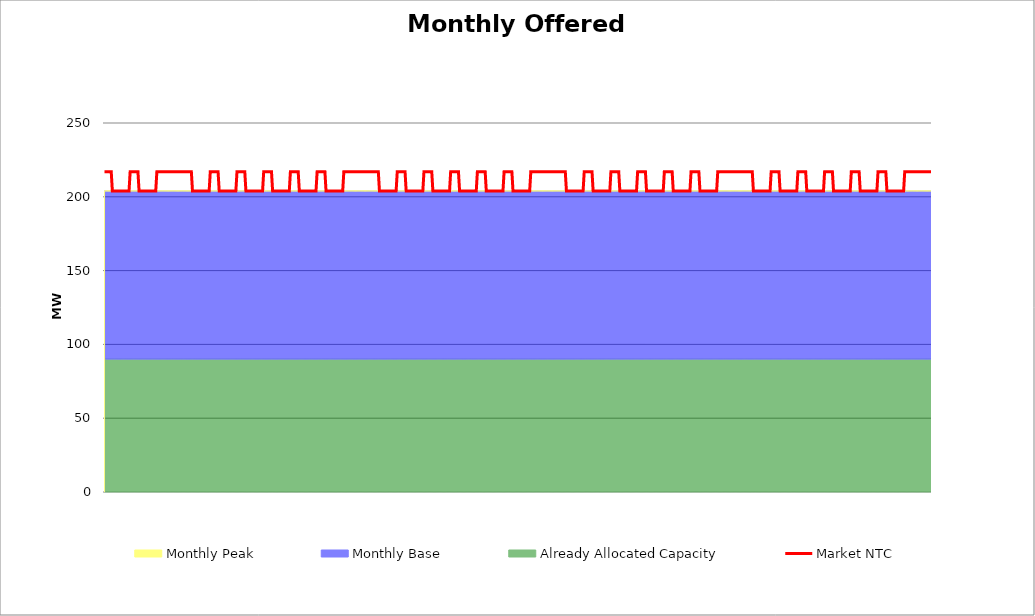
| Category | Market NTC |
|---|---|
| 0 | 217 |
| 1 | 217 |
| 2 | 217 |
| 3 | 217 |
| 4 | 217 |
| 5 | 217 |
| 6 | 217 |
| 7 | 204 |
| 8 | 204 |
| 9 | 204 |
| 10 | 204 |
| 11 | 204 |
| 12 | 204 |
| 13 | 204 |
| 14 | 204 |
| 15 | 204 |
| 16 | 204 |
| 17 | 204 |
| 18 | 204 |
| 19 | 204 |
| 20 | 204 |
| 21 | 204 |
| 22 | 204 |
| 23 | 217 |
| 24 | 217 |
| 25 | 217 |
| 26 | 217 |
| 27 | 217 |
| 28 | 217 |
| 29 | 217 |
| 30 | 217 |
| 31 | 204 |
| 32 | 204 |
| 33 | 204 |
| 34 | 204 |
| 35 | 204 |
| 36 | 204 |
| 37 | 204 |
| 38 | 204 |
| 39 | 204 |
| 40 | 204 |
| 41 | 204 |
| 42 | 204 |
| 43 | 204 |
| 44 | 204 |
| 45 | 204 |
| 46 | 204 |
| 47 | 217 |
| 48 | 217 |
| 49 | 217 |
| 50 | 217 |
| 51 | 217 |
| 52 | 217 |
| 53 | 217 |
| 54 | 217 |
| 55 | 217 |
| 56 | 217 |
| 57 | 217 |
| 58 | 217 |
| 59 | 217 |
| 60 | 217 |
| 61 | 217 |
| 62 | 217 |
| 63 | 217 |
| 64 | 217 |
| 65 | 217 |
| 66 | 217 |
| 67 | 217 |
| 68 | 217 |
| 69 | 217 |
| 70 | 217 |
| 71 | 217 |
| 72 | 217 |
| 73 | 217 |
| 74 | 217 |
| 75 | 217 |
| 76 | 217 |
| 77 | 217 |
| 78 | 217 |
| 79 | 204 |
| 80 | 204 |
| 81 | 204 |
| 82 | 204 |
| 83 | 204 |
| 84 | 204 |
| 85 | 204 |
| 86 | 204 |
| 87 | 204 |
| 88 | 204 |
| 89 | 204 |
| 90 | 204 |
| 91 | 204 |
| 92 | 204 |
| 93 | 204 |
| 94 | 204 |
| 95 | 217 |
| 96 | 217 |
| 97 | 217 |
| 98 | 217 |
| 99 | 217 |
| 100 | 217 |
| 101 | 217 |
| 102 | 217 |
| 103 | 204 |
| 104 | 204 |
| 105 | 204 |
| 106 | 204 |
| 107 | 204 |
| 108 | 204 |
| 109 | 204 |
| 110 | 204 |
| 111 | 204 |
| 112 | 204 |
| 113 | 204 |
| 114 | 204 |
| 115 | 204 |
| 116 | 204 |
| 117 | 204 |
| 118 | 204 |
| 119 | 217 |
| 120 | 217 |
| 121 | 217 |
| 122 | 217 |
| 123 | 217 |
| 124 | 217 |
| 125 | 217 |
| 126 | 217 |
| 127 | 204 |
| 128 | 204 |
| 129 | 204 |
| 130 | 204 |
| 131 | 204 |
| 132 | 204 |
| 133 | 204 |
| 134 | 204 |
| 135 | 204 |
| 136 | 204 |
| 137 | 204 |
| 138 | 204 |
| 139 | 204 |
| 140 | 204 |
| 141 | 204 |
| 142 | 204 |
| 143 | 217 |
| 144 | 217 |
| 145 | 217 |
| 146 | 217 |
| 147 | 217 |
| 148 | 217 |
| 149 | 217 |
| 150 | 217 |
| 151 | 204 |
| 152 | 204 |
| 153 | 204 |
| 154 | 204 |
| 155 | 204 |
| 156 | 204 |
| 157 | 204 |
| 158 | 204 |
| 159 | 204 |
| 160 | 204 |
| 161 | 204 |
| 162 | 204 |
| 163 | 204 |
| 164 | 204 |
| 165 | 204 |
| 166 | 204 |
| 167 | 217 |
| 168 | 217 |
| 169 | 217 |
| 170 | 217 |
| 171 | 217 |
| 172 | 217 |
| 173 | 217 |
| 174 | 217 |
| 175 | 204 |
| 176 | 204 |
| 177 | 204 |
| 178 | 204 |
| 179 | 204 |
| 180 | 204 |
| 181 | 204 |
| 182 | 204 |
| 183 | 204 |
| 184 | 204 |
| 185 | 204 |
| 186 | 204 |
| 187 | 204 |
| 188 | 204 |
| 189 | 204 |
| 190 | 204 |
| 191 | 217 |
| 192 | 217 |
| 193 | 217 |
| 194 | 217 |
| 195 | 217 |
| 196 | 217 |
| 197 | 217 |
| 198 | 217 |
| 199 | 204 |
| 200 | 204 |
| 201 | 204 |
| 202 | 204 |
| 203 | 204 |
| 204 | 204 |
| 205 | 204 |
| 206 | 204 |
| 207 | 204 |
| 208 | 204 |
| 209 | 204 |
| 210 | 204 |
| 211 | 204 |
| 212 | 204 |
| 213 | 204 |
| 214 | 204 |
| 215 | 217 |
| 216 | 217 |
| 217 | 217 |
| 218 | 217 |
| 219 | 217 |
| 220 | 217 |
| 221 | 217 |
| 222 | 217 |
| 223 | 217 |
| 224 | 217 |
| 225 | 217 |
| 226 | 217 |
| 227 | 217 |
| 228 | 217 |
| 229 | 217 |
| 230 | 217 |
| 231 | 217 |
| 232 | 217 |
| 233 | 217 |
| 234 | 217 |
| 235 | 217 |
| 236 | 217 |
| 237 | 217 |
| 238 | 217 |
| 239 | 217 |
| 240 | 217 |
| 241 | 217 |
| 242 | 217 |
| 243 | 217 |
| 244 | 217 |
| 245 | 217 |
| 246 | 217 |
| 247 | 204 |
| 248 | 204 |
| 249 | 204 |
| 250 | 204 |
| 251 | 204 |
| 252 | 204 |
| 253 | 204 |
| 254 | 204 |
| 255 | 204 |
| 256 | 204 |
| 257 | 204 |
| 258 | 204 |
| 259 | 204 |
| 260 | 204 |
| 261 | 204 |
| 262 | 204 |
| 263 | 217 |
| 264 | 217 |
| 265 | 217 |
| 266 | 217 |
| 267 | 217 |
| 268 | 217 |
| 269 | 217 |
| 270 | 217 |
| 271 | 204 |
| 272 | 204 |
| 273 | 204 |
| 274 | 204 |
| 275 | 204 |
| 276 | 204 |
| 277 | 204 |
| 278 | 204 |
| 279 | 204 |
| 280 | 204 |
| 281 | 204 |
| 282 | 204 |
| 283 | 204 |
| 284 | 204 |
| 285 | 204 |
| 286 | 204 |
| 287 | 217 |
| 288 | 217 |
| 289 | 217 |
| 290 | 217 |
| 291 | 217 |
| 292 | 217 |
| 293 | 217 |
| 294 | 217 |
| 295 | 204 |
| 296 | 204 |
| 297 | 204 |
| 298 | 204 |
| 299 | 204 |
| 300 | 204 |
| 301 | 204 |
| 302 | 204 |
| 303 | 204 |
| 304 | 204 |
| 305 | 204 |
| 306 | 204 |
| 307 | 204 |
| 308 | 204 |
| 309 | 204 |
| 310 | 204 |
| 311 | 217 |
| 312 | 217 |
| 313 | 217 |
| 314 | 217 |
| 315 | 217 |
| 316 | 217 |
| 317 | 217 |
| 318 | 217 |
| 319 | 204 |
| 320 | 204 |
| 321 | 204 |
| 322 | 204 |
| 323 | 204 |
| 324 | 204 |
| 325 | 204 |
| 326 | 204 |
| 327 | 204 |
| 328 | 204 |
| 329 | 204 |
| 330 | 204 |
| 331 | 204 |
| 332 | 204 |
| 333 | 204 |
| 334 | 204 |
| 335 | 217 |
| 336 | 217 |
| 337 | 217 |
| 338 | 217 |
| 339 | 217 |
| 340 | 217 |
| 341 | 217 |
| 342 | 217 |
| 343 | 204 |
| 344 | 204 |
| 345 | 204 |
| 346 | 204 |
| 347 | 204 |
| 348 | 204 |
| 349 | 204 |
| 350 | 204 |
| 351 | 204 |
| 352 | 204 |
| 353 | 204 |
| 354 | 204 |
| 355 | 204 |
| 356 | 204 |
| 357 | 204 |
| 358 | 204 |
| 359 | 217 |
| 360 | 217 |
| 361 | 217 |
| 362 | 217 |
| 363 | 217 |
| 364 | 217 |
| 365 | 217 |
| 366 | 217 |
| 367 | 204 |
| 368 | 204 |
| 369 | 204 |
| 370 | 204 |
| 371 | 204 |
| 372 | 204 |
| 373 | 204 |
| 374 | 204 |
| 375 | 204 |
| 376 | 204 |
| 377 | 204 |
| 378 | 204 |
| 379 | 204 |
| 380 | 204 |
| 381 | 204 |
| 382 | 204 |
| 383 | 217 |
| 384 | 217 |
| 385 | 217 |
| 386 | 217 |
| 387 | 217 |
| 388 | 217 |
| 389 | 217 |
| 390 | 217 |
| 391 | 217 |
| 392 | 217 |
| 393 | 217 |
| 394 | 217 |
| 395 | 217 |
| 396 | 217 |
| 397 | 217 |
| 398 | 217 |
| 399 | 217 |
| 400 | 217 |
| 401 | 217 |
| 402 | 217 |
| 403 | 217 |
| 404 | 217 |
| 405 | 217 |
| 406 | 217 |
| 407 | 217 |
| 408 | 217 |
| 409 | 217 |
| 410 | 217 |
| 411 | 217 |
| 412 | 217 |
| 413 | 217 |
| 414 | 217 |
| 415 | 204 |
| 416 | 204 |
| 417 | 204 |
| 418 | 204 |
| 419 | 204 |
| 420 | 204 |
| 421 | 204 |
| 422 | 204 |
| 423 | 204 |
| 424 | 204 |
| 425 | 204 |
| 426 | 204 |
| 427 | 204 |
| 428 | 204 |
| 429 | 204 |
| 430 | 204 |
| 431 | 217 |
| 432 | 217 |
| 433 | 217 |
| 434 | 217 |
| 435 | 217 |
| 436 | 217 |
| 437 | 217 |
| 438 | 217 |
| 439 | 204 |
| 440 | 204 |
| 441 | 204 |
| 442 | 204 |
| 443 | 204 |
| 444 | 204 |
| 445 | 204 |
| 446 | 204 |
| 447 | 204 |
| 448 | 204 |
| 449 | 204 |
| 450 | 204 |
| 451 | 204 |
| 452 | 204 |
| 453 | 204 |
| 454 | 204 |
| 455 | 217 |
| 456 | 217 |
| 457 | 217 |
| 458 | 217 |
| 459 | 217 |
| 460 | 217 |
| 461 | 217 |
| 462 | 217 |
| 463 | 204 |
| 464 | 204 |
| 465 | 204 |
| 466 | 204 |
| 467 | 204 |
| 468 | 204 |
| 469 | 204 |
| 470 | 204 |
| 471 | 204 |
| 472 | 204 |
| 473 | 204 |
| 474 | 204 |
| 475 | 204 |
| 476 | 204 |
| 477 | 204 |
| 478 | 204 |
| 479 | 217 |
| 480 | 217 |
| 481 | 217 |
| 482 | 217 |
| 483 | 217 |
| 484 | 217 |
| 485 | 217 |
| 486 | 217 |
| 487 | 204 |
| 488 | 204 |
| 489 | 204 |
| 490 | 204 |
| 491 | 204 |
| 492 | 204 |
| 493 | 204 |
| 494 | 204 |
| 495 | 204 |
| 496 | 204 |
| 497 | 204 |
| 498 | 204 |
| 499 | 204 |
| 500 | 204 |
| 501 | 204 |
| 502 | 204 |
| 503 | 217 |
| 504 | 217 |
| 505 | 217 |
| 506 | 217 |
| 507 | 217 |
| 508 | 217 |
| 509 | 217 |
| 510 | 217 |
| 511 | 204 |
| 512 | 204 |
| 513 | 204 |
| 514 | 204 |
| 515 | 204 |
| 516 | 204 |
| 517 | 204 |
| 518 | 204 |
| 519 | 204 |
| 520 | 204 |
| 521 | 204 |
| 522 | 204 |
| 523 | 204 |
| 524 | 204 |
| 525 | 204 |
| 526 | 204 |
| 527 | 217 |
| 528 | 217 |
| 529 | 217 |
| 530 | 217 |
| 531 | 217 |
| 532 | 217 |
| 533 | 217 |
| 534 | 217 |
| 535 | 204 |
| 536 | 204 |
| 537 | 204 |
| 538 | 204 |
| 539 | 204 |
| 540 | 204 |
| 541 | 204 |
| 542 | 204 |
| 543 | 204 |
| 544 | 204 |
| 545 | 204 |
| 546 | 204 |
| 547 | 204 |
| 548 | 204 |
| 549 | 204 |
| 550 | 204 |
| 551 | 217 |
| 552 | 217 |
| 553 | 217 |
| 554 | 217 |
| 555 | 217 |
| 556 | 217 |
| 557 | 217 |
| 558 | 217 |
| 559 | 217 |
| 560 | 217 |
| 561 | 217 |
| 562 | 217 |
| 563 | 217 |
| 564 | 217 |
| 565 | 217 |
| 566 | 217 |
| 567 | 217 |
| 568 | 217 |
| 569 | 217 |
| 570 | 217 |
| 571 | 217 |
| 572 | 217 |
| 573 | 217 |
| 574 | 217 |
| 575 | 217 |
| 576 | 217 |
| 577 | 217 |
| 578 | 217 |
| 579 | 217 |
| 580 | 217 |
| 581 | 217 |
| 582 | 217 |
| 583 | 204 |
| 584 | 204 |
| 585 | 204 |
| 586 | 204 |
| 587 | 204 |
| 588 | 204 |
| 589 | 204 |
| 590 | 204 |
| 591 | 204 |
| 592 | 204 |
| 593 | 204 |
| 594 | 204 |
| 595 | 204 |
| 596 | 204 |
| 597 | 204 |
| 598 | 204 |
| 599 | 217 |
| 600 | 217 |
| 601 | 217 |
| 602 | 217 |
| 603 | 217 |
| 604 | 217 |
| 605 | 217 |
| 606 | 217 |
| 607 | 204 |
| 608 | 204 |
| 609 | 204 |
| 610 | 204 |
| 611 | 204 |
| 612 | 204 |
| 613 | 204 |
| 614 | 204 |
| 615 | 204 |
| 616 | 204 |
| 617 | 204 |
| 618 | 204 |
| 619 | 204 |
| 620 | 204 |
| 621 | 204 |
| 622 | 204 |
| 623 | 217 |
| 624 | 217 |
| 625 | 217 |
| 626 | 217 |
| 627 | 217 |
| 628 | 217 |
| 629 | 217 |
| 630 | 217 |
| 631 | 204 |
| 632 | 204 |
| 633 | 204 |
| 634 | 204 |
| 635 | 204 |
| 636 | 204 |
| 637 | 204 |
| 638 | 204 |
| 639 | 204 |
| 640 | 204 |
| 641 | 204 |
| 642 | 204 |
| 643 | 204 |
| 644 | 204 |
| 645 | 204 |
| 646 | 204 |
| 647 | 217 |
| 648 | 217 |
| 649 | 217 |
| 650 | 217 |
| 651 | 217 |
| 652 | 217 |
| 653 | 217 |
| 654 | 217 |
| 655 | 204 |
| 656 | 204 |
| 657 | 204 |
| 658 | 204 |
| 659 | 204 |
| 660 | 204 |
| 661 | 204 |
| 662 | 204 |
| 663 | 204 |
| 664 | 204 |
| 665 | 204 |
| 666 | 204 |
| 667 | 204 |
| 668 | 204 |
| 669 | 204 |
| 670 | 204 |
| 671 | 217 |
| 672 | 217 |
| 673 | 217 |
| 674 | 217 |
| 675 | 217 |
| 676 | 217 |
| 677 | 217 |
| 678 | 217 |
| 679 | 204 |
| 680 | 204 |
| 681 | 204 |
| 682 | 204 |
| 683 | 204 |
| 684 | 204 |
| 685 | 204 |
| 686 | 204 |
| 687 | 204 |
| 688 | 204 |
| 689 | 204 |
| 690 | 204 |
| 691 | 204 |
| 692 | 204 |
| 693 | 204 |
| 694 | 204 |
| 695 | 217 |
| 696 | 217 |
| 697 | 217 |
| 698 | 217 |
| 699 | 217 |
| 700 | 217 |
| 701 | 217 |
| 702 | 217 |
| 703 | 204 |
| 704 | 204 |
| 705 | 204 |
| 706 | 204 |
| 707 | 204 |
| 708 | 204 |
| 709 | 204 |
| 710 | 204 |
| 711 | 204 |
| 712 | 204 |
| 713 | 204 |
| 714 | 204 |
| 715 | 204 |
| 716 | 204 |
| 717 | 204 |
| 718 | 204 |
| 719 | 217 |
| 720 | 217 |
| 721 | 217 |
| 722 | 217 |
| 723 | 217 |
| 724 | 217 |
| 725 | 217 |
| 726 | 217 |
| 727 | 217 |
| 728 | 217 |
| 729 | 217 |
| 730 | 217 |
| 731 | 217 |
| 732 | 217 |
| 733 | 217 |
| 734 | 217 |
| 735 | 217 |
| 736 | 217 |
| 737 | 217 |
| 738 | 217 |
| 739 | 217 |
| 740 | 217 |
| 741 | 217 |
| 742 | 217 |
| 743 | 217 |